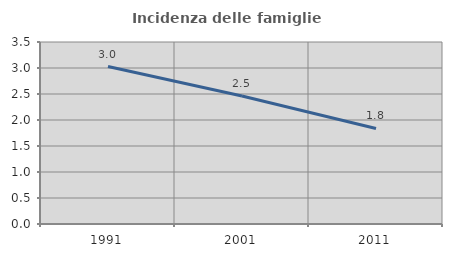
| Category | Incidenza delle famiglie numerose |
|---|---|
| 1991.0 | 3.028 |
| 2001.0 | 2.462 |
| 2011.0 | 1.837 |